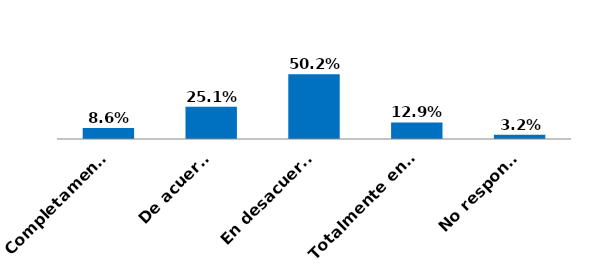
| Category | Series 0 |
|---|---|
| Completamente de acuerdo | 0.086 |
| De acuerdo | 0.251 |
| En desacuerdo | 0.502 |
| Totalmente en desacuerdo | 0.129 |
| No responde | 0.032 |